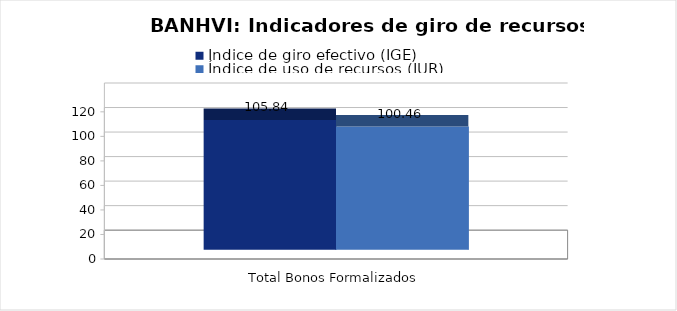
| Category | Índice de giro efectivo (IGE) | Índice de uso de recursos (IUR)  |
|---|---|---|
| Total Bonos Formalizados | 105.837 | 100.459 |